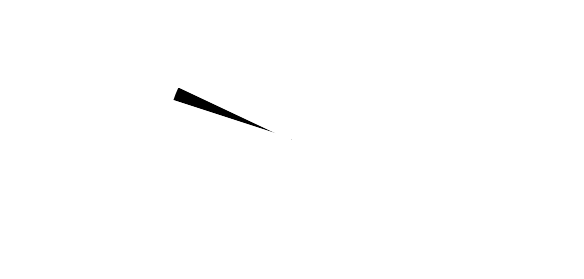
| Category | Series 0 |
|---|---|
| Poloha ručičky | 5 |
| Ručička | 2 |
| Zbytek | 93 |